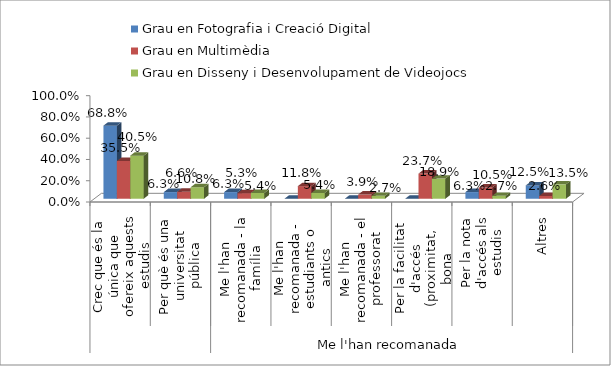
| Category | Grau en Fotografia i Creació Digital | Grau en Multimèdia | Grau en Disseny i Desenvolupament de Videojocs |
|---|---|---|---|
| 0 | 0.688 | 0.355 | 0.405 |
| 1 | 0.062 | 0.066 | 0.108 |
| 2 | 0.062 | 0.053 | 0.054 |
| 3 | 0 | 0.118 | 0.054 |
| 4 | 0 | 0.039 | 0.027 |
| 5 | 0 | 0.237 | 0.189 |
| 6 | 0.062 | 0.105 | 0.027 |
| 7 | 0.125 | 0.026 | 0.135 |